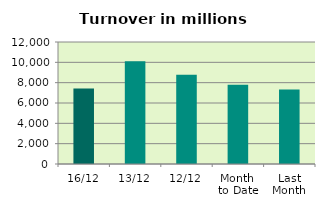
| Category | Series 0 |
|---|---|
| 16/12 | 7436.002 |
| 13/12 | 10108.353 |
| 12/12 | 8787.062 |
| Month 
to Date | 7798.569 |
| Last
Month | 7326.344 |